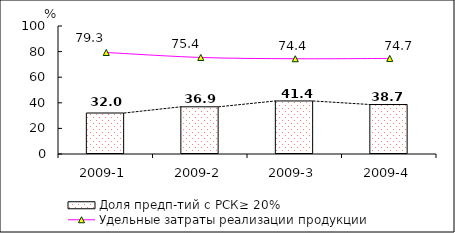
| Category | Доля предп-тий с РСК≥ 20% |
|---|---|
| 2009-1 | 32.027 |
| 2009-2 | 36.873 |
| 2009-3 | 41.438 |
| 2009-4 | 38.657 |